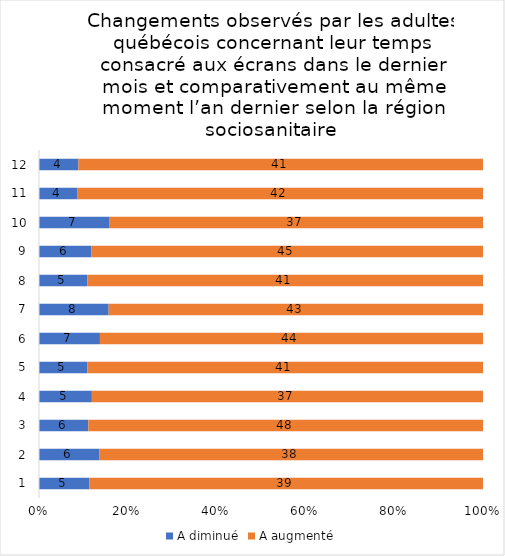
| Category | A diminué | A augmenté |
|---|---|---|
| 0 | 5 | 39 |
| 1 | 6 | 38 |
| 2 | 6 | 48 |
| 3 | 5 | 37 |
| 4 | 5 | 41 |
| 5 | 7 | 44 |
| 6 | 8 | 43 |
| 7 | 5 | 41 |
| 8 | 6 | 45 |
| 9 | 7 | 37 |
| 10 | 4 | 42 |
| 11 | 4 | 41 |